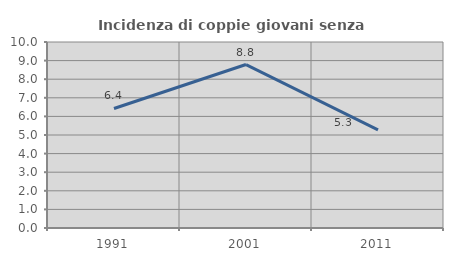
| Category | Incidenza di coppie giovani senza figli |
|---|---|
| 1991.0 | 6.427 |
| 2001.0 | 8.788 |
| 2011.0 | 5.274 |